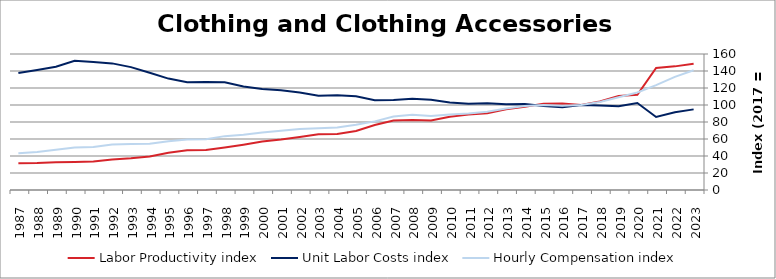
| Category | Labor Productivity index | Unit Labor Costs index | Hourly Compensation index |
|---|---|---|---|
| 2023.0 | 148.464 | 94.848 | 140.816 |
| 2022.0 | 145.45 | 91.468 | 133.04 |
| 2021.0 | 143.578 | 85.878 | 123.302 |
| 2020.0 | 112.064 | 102.417 | 114.772 |
| 2019.0 | 110.678 | 98.567 | 109.092 |
| 2018.0 | 104.176 | 99.497 | 103.652 |
| 2017.0 | 100 | 100 | 100 |
| 2016.0 | 101.868 | 97.422 | 99.241 |
| 2015.0 | 101.361 | 98.71 | 100.053 |
| 2014.0 | 97.884 | 101.08 | 98.941 |
| 2013.0 | 95.001 | 100.878 | 95.835 |
| 2012.0 | 90.392 | 101.982 | 92.184 |
| 2011.0 | 88.678 | 101.557 | 90.059 |
| 2010.0 | 86.266 | 102.895 | 88.764 |
| 2009.0 | 81.846 | 106.26 | 86.969 |
| 2008.0 | 82.485 | 107.265 | 88.478 |
| 2007.0 | 81.676 | 105.988 | 86.567 |
| 2006.0 | 76.404 | 105.693 | 80.753 |
| 2005.0 | 69.511 | 110.311 | 76.679 |
| 2004.0 | 65.931 | 111.411 | 73.454 |
| 2003.0 | 65.638 | 110.782 | 72.715 |
| 2002.0 | 62.429 | 114.82 | 71.681 |
| 2001.0 | 59.365 | 117.401 | 69.695 |
| 2000.0 | 57.006 | 118.761 | 67.701 |
| 1999.0 | 53.322 | 121.811 | 64.952 |
| 1998.0 | 50.03 | 126.664 | 63.37 |
| 1997.0 | 47.077 | 127.041 | 59.807 |
| 1996.0 | 46.826 | 126.906 | 59.425 |
| 1995.0 | 43.732 | 131.079 | 57.324 |
| 1994.0 | 39.462 | 137.897 | 54.417 |
| 1993.0 | 37.372 | 144.58 | 54.032 |
| 1992.0 | 35.866 | 148.965 | 53.428 |
| 1991.0 | 33.565 | 150.613 | 50.553 |
| 1990.0 | 32.957 | 151.942 | 50.075 |
| 1989.0 | 32.693 | 144.977 | 47.397 |
| 1988.0 | 31.748 | 141.108 | 44.799 |
| 1987.0 | 31.369 | 137.563 | 43.152 |